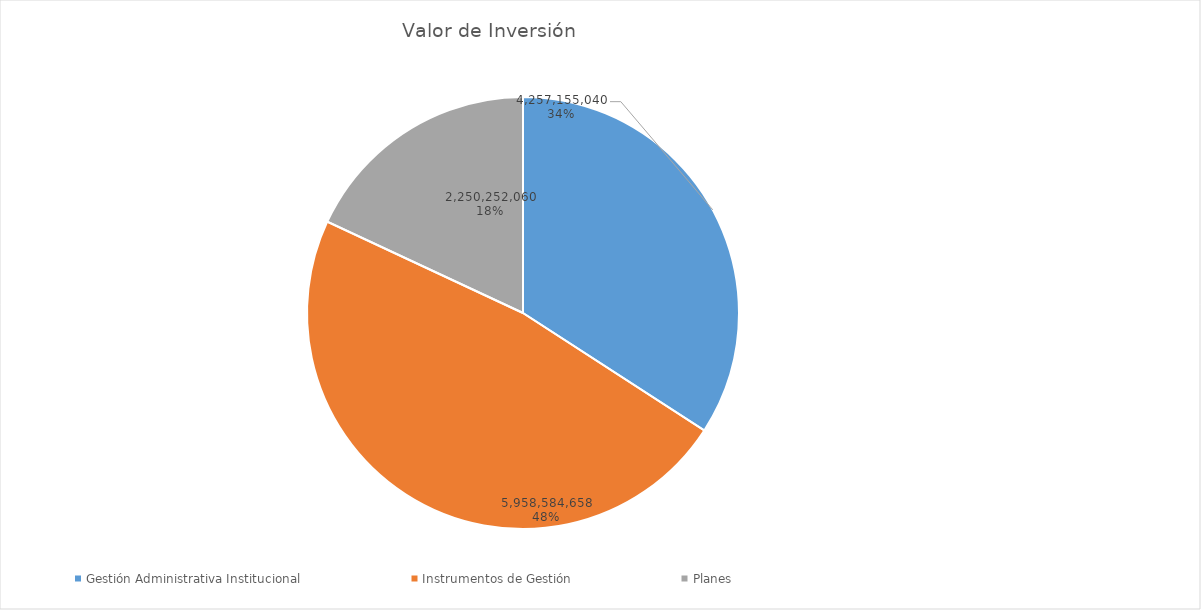
| Category | Valor de Inversión | Porcentaje de Ejecución dentro de la Actividad |
|---|---|---|
| Gestión Administrativa Institucional | 4257155040 | 12 |
| Instrumentos de Gestión | 5958584658 | 20 |
| Planes | 2250252060 | 20 |